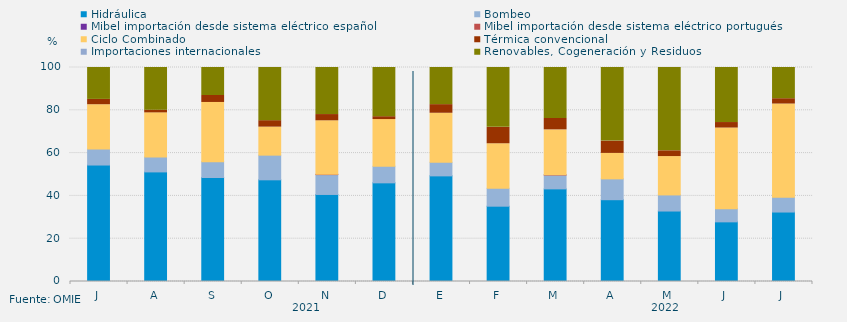
| Category | Hidráulica | Bombeo | Mibel importación desde sistema eléctrico español | Mibel importación desde sistema eléctrico portugués | Ciclo Combinado | Térmica convencional | Importaciones internacionales | Renovables, Cogeneración y Residuos |
|---|---|---|---|---|---|---|---|---|
| J | 54.424 | 7.471 | 0 | 0 | 20.71 | 2.487 | 0 | 14.908 |
| A | 51.211 | 6.931 | 0 | 0 | 20.659 | 1.279 | 0 | 19.919 |
| S | 48.586 | 7.395 | 0 | 0 | 27.677 | 3.245 | 0 | 13.097 |
| O | 47.516 | 11.526 | 0 | 0 | 13.093 | 3.021 | 0 | 24.843 |
| N | 40.671 | 9.282 | 0 | 0.139 | 25 | 2.917 | 0 | 21.991 |
| D | 46.102 | 7.728 | 0 | 0 | 21.841 | 1.344 | 0 | 22.984 |
| E | 49.362 | 6.328 | 0 | 0 | 22.928 | 4.032 | 0 | 17.35 |
| F | 35.193 | 8.333 | 0 | 0 | 20.833 | 7.664 | 0 | 27.976 |
| M | 43.282 | 6.472 | 0 | 0.135 | 20.962 | 5.328 | 0 | 23.822 |
| A | 38.224 | 9.736 | 0 | 0 | 11.892 | 5.749 | 0 | 34.4 |
| M | 32.929 | 7.525 | 0 | 0 | 17.925 | 2.695 | 0 | 38.926 |
| J | 27.87 | 6.134 | 0 | 0 | 37.708 | 2.569 | 0 | 25.718 |
| J | 32.46 | 6.855 | 0 | 0 | 43.616 | 2.487 | 0 | 14.583 |